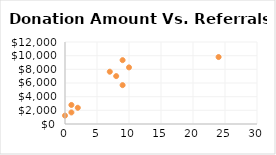
| Category | Referrals |
|---|---|
| 0.0 | 1227 |
| 2.0 | 2374 |
| 10.0 | 8286 |
| 24.0 | 9800 |
| 1.0 | 1693 |
| 9.0 | 5685 |
| 9.0 | 9344 |
| 1.0 | 2785 |
| 8.0 | 7010 |
| 7.0 | 7651 |